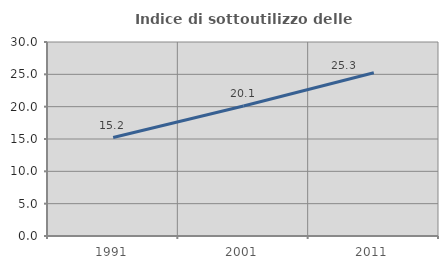
| Category | Indice di sottoutilizzo delle abitazioni  |
|---|---|
| 1991.0 | 15.221 |
| 2001.0 | 20.092 |
| 2011.0 | 25.253 |